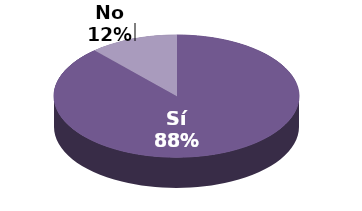
| Category | Series 1 |
|---|---|
| Sí | 205 |
| No | 27 |